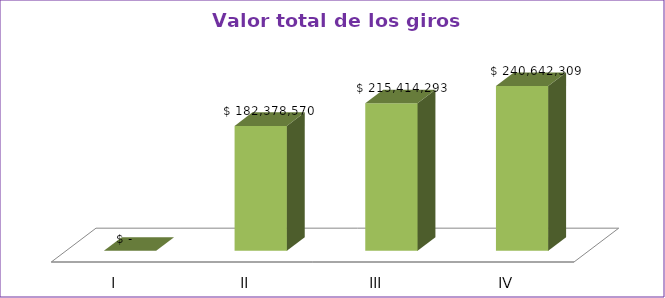
| Category | Series 0 |
|---|---|
| I | 0 |
| II | 182378570 |
| III | 215414293 |
| IV | 240642309 |